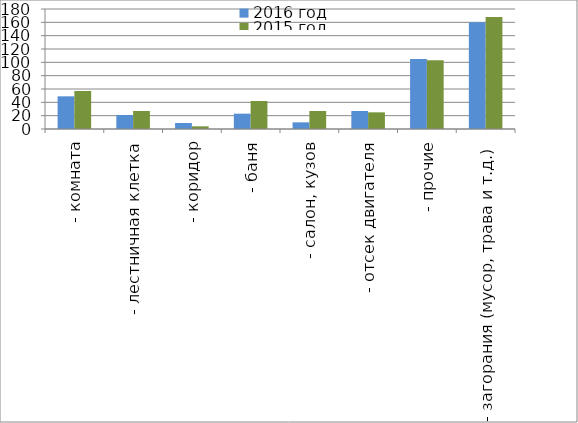
| Category | 2016 год | 2015 год |
|---|---|---|
|  - комната | 49 | 57 |
|  - лестничная клетка | 21 | 27 |
|  - коридор | 9 | 4 |
|  - баня | 23 | 42 |
|  - салон, кузов | 10 | 27 |
|  - отсек двигателя | 27 | 25 |
| - прочие | 105 | 103 |
| - загорания (мусор, трава и т.д.)  | 160 | 168 |